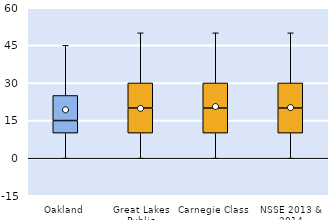
| Category | 25th | 50th | 75th |
|---|---|---|---|
| Oakland | 10 | 5 | 10 |
| Great Lakes Public | 10 | 10 | 10 |
| Carnegie Class | 10 | 10 | 10 |
| NSSE 2013 & 2014 | 10 | 10 | 10 |